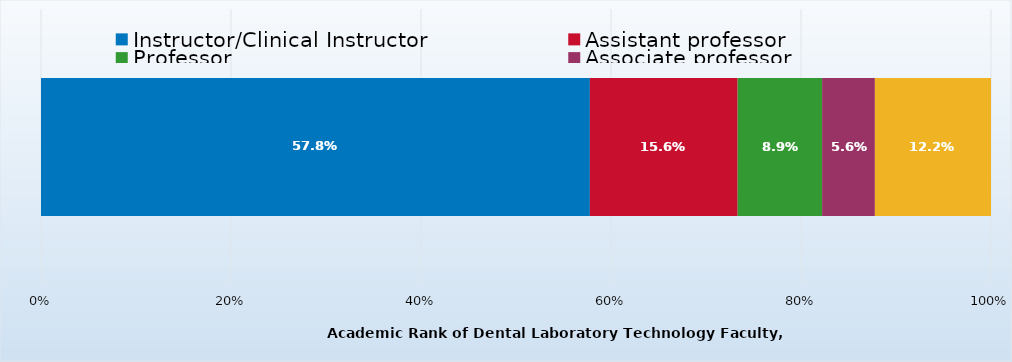
| Category | Instructor/Clinical Instructor | Assistant professor | Professor | Associate professor | Lab technician/Lab associate |
|---|---|---|---|---|---|
| 0 | 0.578 | 0.156 | 0.089 | 0.056 | 0.122 |